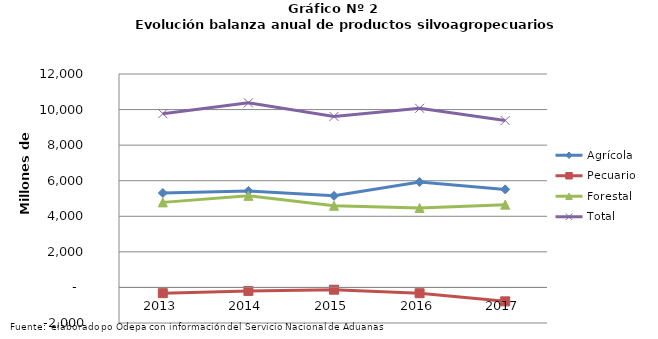
| Category | Agrícola | Pecuario | Forestal | Total |
|---|---|---|---|---|
| 2013.0 | 5309603 | -322473 | 4781973 | 9769103 |
| 2014.0 | 5424524 | -195643 | 5149868 | 10378749 |
| 2015.0 | 5149872 | -127785 | 4591408 | 9613495 |
| 2016.0 | 5928552 | -325380 | 4468104 | 10071276 |
| 2017.0 | 5511206 | -782581 | 4655452 | 9384077 |